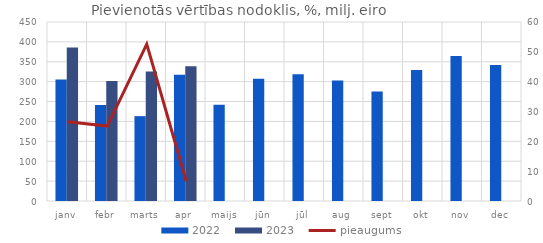
| Category | 2022 | 2023 |
|---|---|---|
| janv | 305.157 | 386.11 |
| febr | 241.225 | 301.806 |
| marts | 213.27 | 325.432 |
| apr | 317.51 | 338.499 |
| maijs | 241.876 | 0 |
| jūn | 307.379 | 0 |
| jūl | 318.39 | 0 |
| aug | 302.725 | 0 |
| sept | 275.431 | 0 |
| okt | 329.143 | 0 |
| nov | 364.477 | 0 |
| dec | 342.088 | 0 |